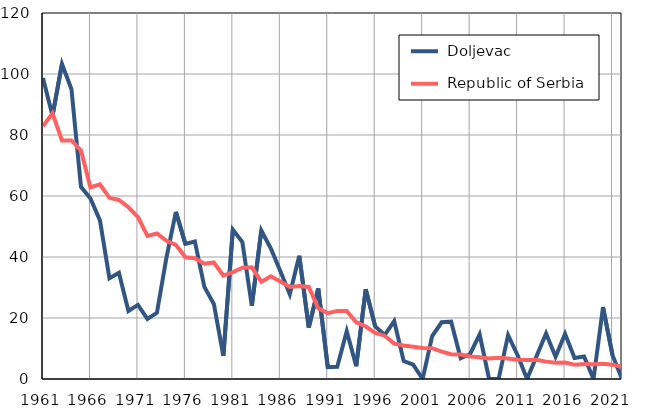
| Category |  Doljevac |  Republic of Serbia |
|---|---|---|
| 1961.0 | 98.7 | 82.9 |
| 1962.0 | 86.3 | 87.1 |
| 1963.0 | 103.3 | 78.2 |
| 1964.0 | 95 | 78.2 |
| 1965.0 | 63 | 74.9 |
| 1966.0 | 59.2 | 62.8 |
| 1967.0 | 52 | 63.8 |
| 1968.0 | 33 | 59.4 |
| 1969.0 | 34.8 | 58.7 |
| 1970.0 | 22.3 | 56.3 |
| 1971.0 | 24.3 | 53.1 |
| 1972.0 | 19.7 | 46.9 |
| 1973.0 | 21.7 | 47.7 |
| 1974.0 | 39.7 | 45.3 |
| 1975.0 | 54.8 | 44 |
| 1976.0 | 44.3 | 39.9 |
| 1977.0 | 45.1 | 39.6 |
| 1978.0 | 30.2 | 37.8 |
| 1979.0 | 24.6 | 38.2 |
| 1980.0 | 7.6 | 33.9 |
| 1981.0 | 49 | 35 |
| 1982.0 | 44.9 | 36.5 |
| 1983.0 | 24 | 36.6 |
| 1984.0 | 48.7 | 31.9 |
| 1985.0 | 42.8 | 33.7 |
| 1986.0 | 35.4 | 32 |
| 1987.0 | 27.8 | 30.2 |
| 1988.0 | 40.4 | 30.5 |
| 1989.0 | 16.9 | 30.2 |
| 1990.0 | 29.7 | 23.2 |
| 1991.0 | 3.9 | 21.6 |
| 1992.0 | 4 | 22.3 |
| 1993.0 | 15.7 | 22.3 |
| 1994.0 | 4.2 | 18.6 |
| 1995.0 | 29.4 | 17.2 |
| 1996.0 | 17.2 | 15.1 |
| 1997.0 | 14.4 | 14.2 |
| 1998.0 | 19 | 11.6 |
| 1999.0 | 5.9 | 11 |
| 2000.0 | 4.7 | 10.6 |
| 2001.0 | 0 | 10.2 |
| 2002.0 | 14.1 | 10.1 |
| 2003.0 | 18.6 | 9 |
| 2004.0 | 18.8 | 8.1 |
| 2005.0 | 6.8 | 8 |
| 2006.0 | 8.2 | 7.4 |
| 2007.0 | 14.6 | 7.1 |
| 2008.0 | 0 | 6.7 |
| 2009.0 | 0 | 7 |
| 2010.0 | 14.4 | 6.7 |
| 2011.0 | 7.8 | 6.3 |
| 2012.0 | 0 | 6.2 |
| 2013.0 | 7.5 | 6.3 |
| 2014.0 | 14.9 | 5.7 |
| 2015.0 | 7.3 | 5.3 |
| 2016.0 | 14.8 | 5.4 |
| 2017.0 | 6.9 | 4.7 |
| 2018.0 | 7.4 | 4.9 |
| 2019.0 | 0 | 4.8 |
| 2020.0 | 23.6 | 5 |
| 2021.0 | 7.8 | 4.7 |
| 2022.0 | 0 | 4 |